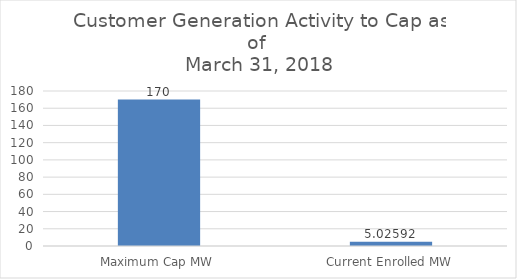
| Category | Series 0 |
|---|---|
| Maximum Cap MW | 170 |
| Current Enrolled MW | 5.026 |